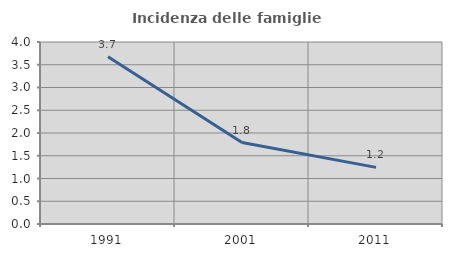
| Category | Incidenza delle famiglie numerose |
|---|---|
| 1991.0 | 3.675 |
| 2001.0 | 1.79 |
| 2011.0 | 1.245 |